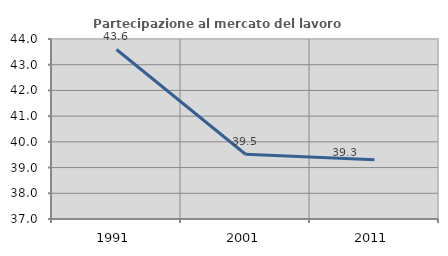
| Category | Partecipazione al mercato del lavoro  femminile |
|---|---|
| 1991.0 | 43.593 |
| 2001.0 | 39.517 |
| 2011.0 | 39.306 |